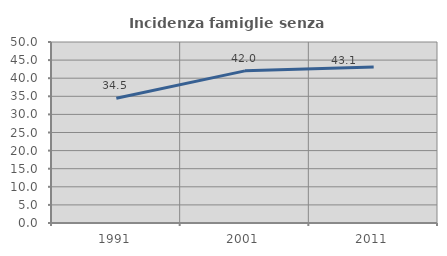
| Category | Incidenza famiglie senza nuclei |
|---|---|
| 1991.0 | 34.463 |
| 2001.0 | 42.025 |
| 2011.0 | 43.087 |